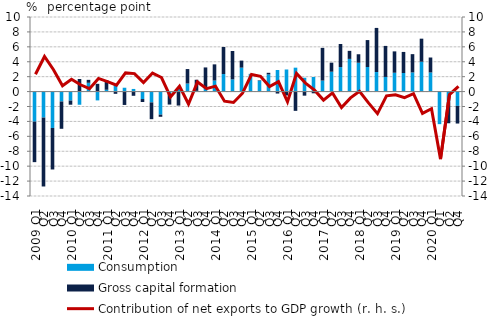
| Category | Consumption | Gross capital formation |
|---|---|---|
| 2009 Q1 | -4.026 | -5.434 |
| Q2 | -3.484 | -9.24 |
| Q3 | -4.878 | -5.566 |
| Q4 | -1.328 | -3.66 |
| 2010 Q1 | -1.202 | -0.558 |
| Q2 | -1.765 | 1.69 |
| Q3 | 1.178 | 0.396 |
| Q4 | -1.182 | 1.04 |
| 2011 Q1 | 0.246 | 1.291 |
| Q2 | 0.953 | -0.3 |
| Q3 | 0.516 | -1.792 |
| Q4 | 0.353 | -0.564 |
| 2012 Q1 | -0.999 | -0.394 |
| Q2 | -1.45 | -2.251 |
| Q3 | -3.09 | -0.289 |
| Q4 | -0.227 | -1.513 |
| 2013 Q1 | 0.409 | -1.874 |
| Q2 | 1.081 | 1.94 |
| Q3 | 0.1 | 1.487 |
| Q4 | 0.451 | 2.786 |
| 2014 Q1 | 1.483 | 2.167 |
| Q2 | 2.351 | 3.624 |
| Q3 | 1.636 | 3.804 |
| Q4 | 3.21 | 0.942 |
| 2015 Q1 | 2.317 | 0.054 |
| Q2 | 1.457 | 0.063 |
| Q3 | 2.302 | 0.214 |
| Q4 | 2.894 | -0.261 |
| 2016 Q1 | 2.962 | -0.518 |
| Q2 | 3.206 | -2.583 |
| Q3 | 1.854 | -0.547 |
| Q4 | 1.958 | -0.229 |
| 2017 Q1 | 1.476 | 4.386 |
| Q2 | 2.665 | 1.212 |
| Q3 | 3.282 | 3.1 |
| Q4 | 4.384 | 1.078 |
| 2018 Q1 | 3.87 | 1.136 |
| Q2 | 3.294 | 3.613 |
| Q3 | 2.622 | 5.915 |
| Q4 | 1.964 | 4.16 |
| 2019 Q1 | 2.526 | 2.864 |
| Q2 | 2.49 | 2.826 |
| Q3 | 2.57 | 2.449 |
| Q4 | 4.004 | 3.09 |
| 2020 Q1 | 2.567 | 2.001 |
| Q1 | -4.366 | 0.061 |
| Q2 | -1.413 | -2.833 |
| Q4 | -1.913 | -2.37 |